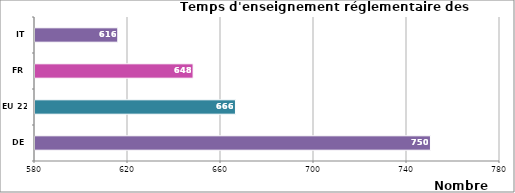
| Category | Series 0 |
|---|---|
| DE | 750.087 |
| EU 22 | 666.218 |
| FR | 648 |
| IT | 615.6 |